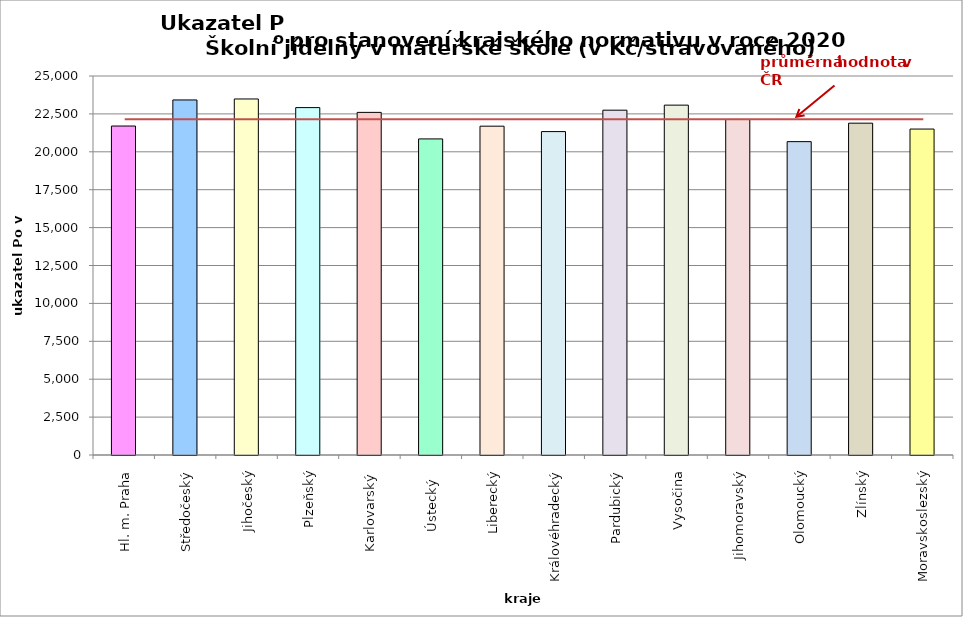
| Category | Series 0 |
|---|---|
| Hl. m. Praha | 21700 |
| Středočeský | 23420 |
| Jihočeský | 23484 |
| Plzeňský | 22915 |
| Karlovarský  | 22600 |
| Ústecký   | 20850 |
| Liberecký | 21690 |
| Královéhradecký | 21333 |
| Pardubický | 22745 |
| Vysočina | 23078 |
| Jihomoravský | 22132 |
| Olomoucký | 20671 |
| Zlínský | 21888 |
| Moravskoslezský | 21500 |